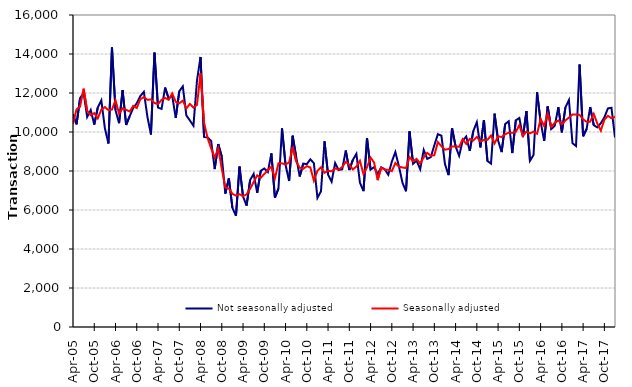
| Category | Not seasonally adjusted | Seasonally adjusted |
|---|---|---|
| 2005-04-01 | 10920 | 10410 |
| 2005-05-01 | 10390 | 11160 |
| 2005-06-01 | 11740 | 11300 |
| 2005-07-01 | 12000 | 12220 |
| 2005-08-01 | 10770 | 11090 |
| 2005-09-01 | 11130 | 10860 |
| 2005-10-01 | 10380 | 10970 |
| 2005-11-01 | 11260 | 10700 |
| 2005-12-01 | 11620 | 11140 |
| 2006-01-01 | 10190 | 11280 |
| 2006-02-01 | 9410 | 11120 |
| 2006-03-01 | 14330 | 11150 |
| 2006-04-01 | 11120 | 11630 |
| 2006-05-01 | 10450 | 10940 |
| 2006-06-01 | 12150 | 11210 |
| 2006-07-01 | 10360 | 11140 |
| 2006-08-01 | 10810 | 11050 |
| 2006-09-01 | 11230 | 11340 |
| 2006-10-01 | 11470 | 11230 |
| 2006-11-01 | 11840 | 11680 |
| 2006-12-01 | 12060 | 11790 |
| 2007-01-01 | 10790 | 11650 |
| 2007-02-01 | 9870 | 11670 |
| 2007-03-01 | 14070 | 11490 |
| 2007-04-01 | 11250 | 11430 |
| 2007-05-01 | 11180 | 11650 |
| 2007-06-01 | 12280 | 11750 |
| 2007-07-01 | 11720 | 11650 |
| 2007-08-01 | 11860 | 11980 |
| 2007-09-01 | 10720 | 11550 |
| 2007-10-01 | 12090 | 11470 |
| 2007-11-01 | 12340 | 11610 |
| 2007-12-01 | 10850 | 11210 |
| 2008-01-01 | 10590 | 11440 |
| 2008-02-01 | 10320 | 11250 |
| 2008-03-01 | 12640 | 11390 |
| 2008-04-01 | 13850 | 13010 |
| 2008-05-01 | 9750 | 10470 |
| 2008-06-01 | 9720 | 9690 |
| 2008-07-01 | 9540 | 9160 |
| 2008-08-01 | 8100 | 8680 |
| 2008-09-01 | 9380 | 9160 |
| 2008-10-01 | 8740 | 8110 |
| 2008-11-01 | 6840 | 7160 |
| 2008-12-01 | 7620 | 7100 |
| 2009-01-01 | 6110 | 6830 |
| 2009-02-01 | 5700 | 6740 |
| 2009-03-01 | 8230 | 6810 |
| 2009-04-01 | 6690 | 6710 |
| 2009-05-01 | 6220 | 6800 |
| 2009-06-01 | 7540 | 7090 |
| 2009-07-01 | 7850 | 7430 |
| 2009-08-01 | 6880 | 7780 |
| 2009-09-01 | 8010 | 7650 |
| 2009-10-01 | 8130 | 7850 |
| 2009-11-01 | 7950 | 8040 |
| 2009-12-01 | 8900 | 8220 |
| 2010-01-01 | 6630 | 7630 |
| 2010-02-01 | 7100 | 8400 |
| 2010-03-01 | 10190 | 8390 |
| 2010-04-01 | 8320 | 8340 |
| 2010-05-01 | 7490 | 8430 |
| 2010-06-01 | 9810 | 9240 |
| 2010-07-01 | 8720 | 8490 |
| 2010-08-01 | 7720 | 8170 |
| 2010-09-01 | 8380 | 8110 |
| 2010-10-01 | 8350 | 8250 |
| 2010-11-01 | 8600 | 8180 |
| 2010-12-01 | 8400 | 7500 |
| 2011-01-01 | 6620 | 8010 |
| 2011-02-01 | 6960 | 8190 |
| 2011-03-01 | 9520 | 7910 |
| 2011-04-01 | 7810 | 8000 |
| 2011-05-01 | 7450 | 7990 |
| 2011-06-01 | 8410 | 8130 |
| 2011-07-01 | 8050 | 8070 |
| 2011-08-01 | 8090 | 8200 |
| 2011-09-01 | 9050 | 8470 |
| 2011-10-01 | 8050 | 8320 |
| 2011-11-01 | 8570 | 8080 |
| 2011-12-01 | 8880 | 8230 |
| 2012-01-01 | 7400 | 8520 |
| 2012-02-01 | 6970 | 7840 |
| 2012-03-01 | 9690 | 8190 |
| 2012-04-01 | 8070 | 8690 |
| 2012-05-01 | 8200 | 8430 |
| 2012-06-01 | 7850 | 7530 |
| 2012-07-01 | 8190 | 8170 |
| 2012-08-01 | 8090 | 8070 |
| 2012-09-01 | 7810 | 8070 |
| 2012-10-01 | 8480 | 7990 |
| 2012-11-01 | 8970 | 8410 |
| 2012-12-01 | 8250 | 8220 |
| 2013-01-01 | 7400 | 8180 |
| 2013-02-01 | 6960 | 8150 |
| 2013-03-01 | 10030 | 8710 |
| 2013-04-01 | 8370 | 8500 |
| 2013-05-01 | 8530 | 8620 |
| 2013-06-01 | 8090 | 8380 |
| 2013-07-01 | 9080 | 8700 |
| 2013-08-01 | 8620 | 8930 |
| 2013-09-01 | 8710 | 8780 |
| 2013-10-01 | 9320 | 8810 |
| 2013-11-01 | 9890 | 9480 |
| 2013-12-01 | 9810 | 9270 |
| 2014-01-01 | 8360 | 9090 |
| 2014-02-01 | 7790 | 9130 |
| 2014-03-01 | 10200 | 9260 |
| 2014-04-01 | 9260 | 9260 |
| 2014-05-01 | 8780 | 9240 |
| 2014-06-01 | 9550 | 9630 |
| 2014-07-01 | 9770 | 9390 |
| 2014-08-01 | 9030 | 9650 |
| 2014-09-01 | 10050 | 9570 |
| 2014-10-01 | 10500 | 9750 |
| 2014-11-01 | 9210 | 9520 |
| 2014-12-01 | 10610 | 9590 |
| 2015-01-01 | 8510 | 9600 |
| 2015-02-01 | 8380 | 9820 |
| 2015-03-01 | 10940 | 9410 |
| 2015-04-01 | 9560 | 9780 |
| 2015-05-01 | 8970 | 9740 |
| 2015-06-01 | 10410 | 9880 |
| 2015-07-01 | 10550 | 9970 |
| 2015-08-01 | 8920 | 9960 |
| 2015-09-01 | 10600 | 10010 |
| 2015-10-01 | 10720 | 10350 |
| 2015-11-01 | 9740 | 9800 |
| 2015-12-01 | 11070 | 10020 |
| 2016-01-01 | 8520 | 9930 |
| 2016-02-01 | 8820 | 10020 |
| 2016-03-01 | 12040 | 9910 |
| 2016-04-01 | 10530 | 10660 |
| 2016-05-01 | 9550 | 10310 |
| 2016-06-01 | 11310 | 10940 |
| 2016-07-01 | 10150 | 10260 |
| 2016-08-01 | 10320 | 10470 |
| 2016-09-01 | 11270 | 10590 |
| 2016-10-01 | 9980 | 10390 |
| 2016-11-01 | 11260 | 10590 |
| 2016-12-01 | 11640 | 10740 |
| 2017-01-01 | 9420 | 10900 |
| 2017-02-01 | 9280 | 10900 |
| 2017-03-01 | 13460 | 10880 |
| 2017-04-01 | 9780 | 10650 |
| 2017-05-01 | 10160 | 10520 |
| 2017-06-01 | 11280 | 10530 |
| 2017-07-01 | 10350 | 10930 |
| 2017-08-01 | 10240 | 10440 |
| 2017-09-01 | 10450 | 10070 |
| 2017-10-01 | 10750 | 10630 |
| 2017-11-01 | 11210 | 10830 |
| 2017-12-01 | 11240 | 10710 |
| 2018-01-01 | 9720 | 10780 |